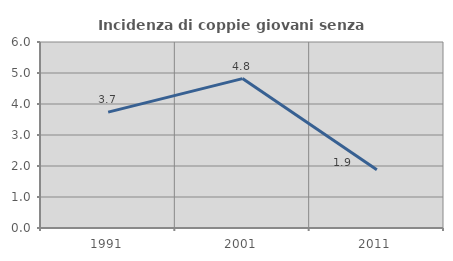
| Category | Incidenza di coppie giovani senza figli |
|---|---|
| 1991.0 | 3.738 |
| 2001.0 | 4.819 |
| 2011.0 | 1.881 |